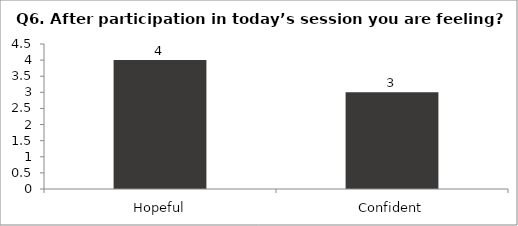
| Category | Q6. After participation in today’s session you are feeling? |
|---|---|
| Hopeful | 4 |
| Confident | 3 |